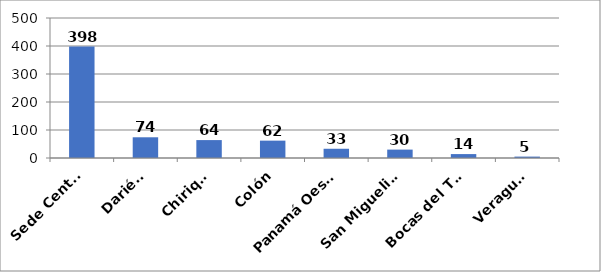
| Category | Series 0 |
|---|---|
| Sede Central | 398 |
| Darién  | 74 |
| Chiriquí | 64 |
| Colón | 62 |
| Panamá Oeste  | 33 |
| San Miguelito  | 30 |
| Bocas del Toro | 14 |
| Veraguas | 5 |